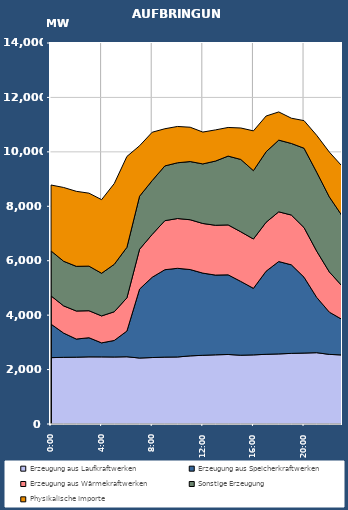
| Category | Erzeugung aus Laufkraftwerken | Erzeugung aus Speicherkraftwerken | Erzeugung aus Wärmekraftwerken | Sonstige Erzeugung | Physikalische Importe |
|---|---|---|---|---|---|
| 2007-01-17 | 2438.757 | 1232.278 | 1037.811 | 1652.598 | 2420.434 |
| 2007-01-17 01:00:00 | 2450.242 | 890.629 | 999.727 | 1639.126 | 2711.634 |
| 2007-01-17 02:00:00 | 2455.403 | 665.839 | 1031.526 | 1640.919 | 2756.206 |
| 2007-01-17 03:00:00 | 2467.557 | 702.317 | 992.723 | 1638.268 | 2681.118 |
| 2007-01-17 04:00:00 | 2466.285 | 514.899 | 990.699 | 1566.754 | 2704.938 |
| 2007-01-17 05:00:00 | 2462.45 | 607.36 | 1054.679 | 1742.957 | 2967.098 |
| 2007-01-17 06:00:00 | 2470.762 | 944.852 | 1219.575 | 1857.522 | 3338.574 |
| 2007-01-17 07:00:00 | 2424.317 | 2533.389 | 1464.062 | 1948.419 | 1853.894 |
| 2007-01-17 08:00:00 | 2441.859 | 2950.959 | 1574.557 | 1978.998 | 1774.754 |
| 2007-01-17 09:00:00 | 2457.545 | 3211.708 | 1802.646 | 2011.341 | 1366.094 |
| 2007-01-17 10:00:00 | 2462.834 | 3258.101 | 1829.551 | 2048.386 | 1334.094 |
| 2007-01-17 11:00:00 | 2503.532 | 3172.214 | 1830.005 | 2138.001 | 1261.292 |
| 2007-01-17 12:00:00 | 2524.408 | 3019.696 | 1824.085 | 2188.738 | 1169.947 |
| 2007-01-17 13:00:00 | 2541.937 | 2929.87 | 1829.82 | 2359.981 | 1145.138 |
| 2007-01-17 14:00:00 | 2554.606 | 2926.404 | 1834.327 | 2528.617 | 1052.3 |
| 2007-01-17 15:00:00 | 2526.974 | 2712.687 | 1824.01 | 2657.234 | 1155.9 |
| 2007-01-17 16:00:00 | 2539.626 | 2445.575 | 1813.175 | 2511.286 | 1461.394 |
| 2007-01-17 17:00:00 | 2560.744 | 3053.424 | 1798.5 | 2589.916 | 1314.242 |
| 2007-01-17 18:00:00 | 2575.22 | 3394.463 | 1826.89 | 2634.557 | 1036.094 |
| 2007-01-17 19:00:00 | 2594.907 | 3253.553 | 1829.246 | 2630.06 | 928.494 |
| 2007-01-17 20:00:00 | 2606.977 | 2787.374 | 1824.445 | 2914.844 | 1013.574 |
| 2007-01-17 21:00:00 | 2620.619 | 2032.255 | 1699.386 | 2900.458 | 1354.774 |
| 2007-01-17 22:00:00 | 2557.924 | 1552.91 | 1475.878 | 2757.005 | 1647.174 |
| 2007-01-17 23:00:00 | 2537.003 | 1306.539 | 1232.167 | 2578.342 | 1823.174 |